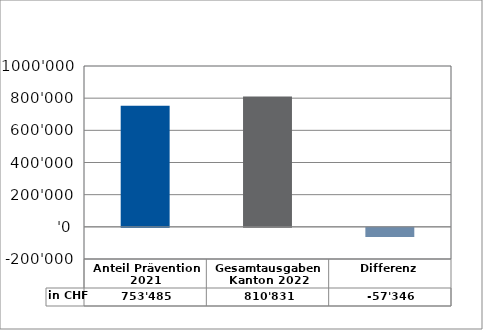
| Category | in CHF |
|---|---|
| Anteil Prävention 2021

 | 753485.15 |
| Gesamtausgaben Kanton 2022
 | 810831 |
| Differenz | -57345.85 |